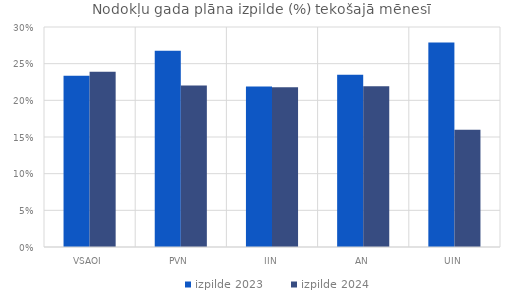
| Category | izpilde 2023 | izpilde 2024 |
|---|---|---|
| VSAOI | 0.233 | 0.239 |
| PVN | 0.268 | 0.22 |
| IIN | 0.219 | 0.218 |
| AN | 0.235 | 0.219 |
| UIN | 0.279 | 0.16 |